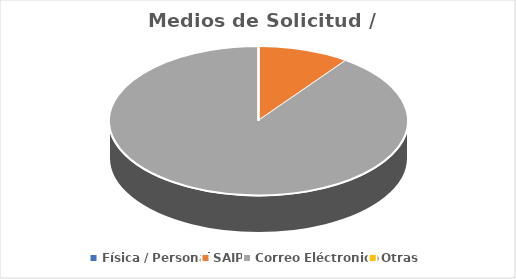
| Category | Series 0 |
|---|---|
| Física / Personal | 0 |
| SAIP | 1 |
| Correo Eléctronico | 9 |
| Otras | 0 |